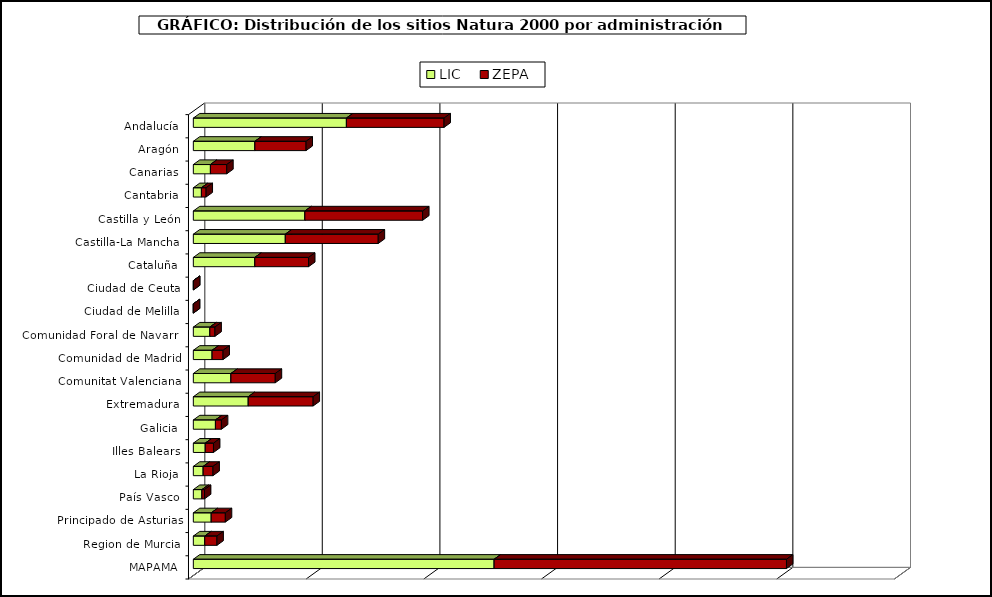
| Category | LIC | ZEPA |
|---|---|---|
| Andalucía | 2602259.904 | 1659578.819 |
| Aragón | 1046501.757 | 869801.449 |
| Canarias | 290532.269 | 277281.575 |
| Cantabria | 137559.299 | 79103.844 |
| Castilla y León | 1896220.058 | 2001839.902 |
| Castilla-La Mancha | 1563874.041 | 1579154.76 |
| Cataluña | 1045133.144 | 913509.288 |
| Ciudad de Ceuta | 1466.731 | 630.322 |
| Ciudad de Melilla | 91.58 | 0 |
| Comunidad Foral de Navarra | 280848.218 | 86327.381 |
| Comunidad de Madrid | 319471.657 | 185331.601 |
| Comunitat Valenciana | 639189.537 | 753402.813 |
| Extremadura | 933772.683 | 1102403.887 |
| Galicia | 375754.191 | 101469.411 |
| Illes Balears | 202815.38 | 139461.266 |
| La Rioja | 167545.786 | 165835.626 |
| País Vasco | 146449.634 | 42054.574 |
| Principado de Asturias | 304372.301 | 239508.01 |
| Region de Murcia | 194438.133 | 206653.103 |
| MAPAMA | 5113800.274 | 4969812.686 |